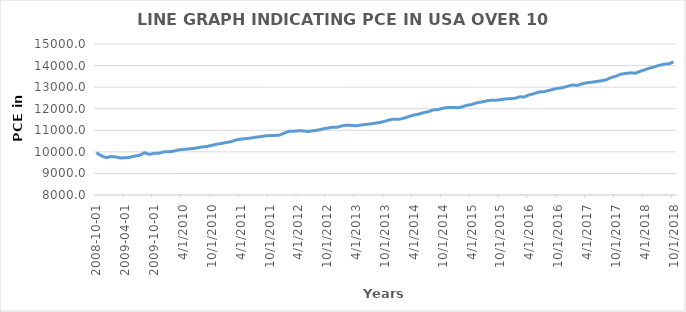
| Category | PCE |
|---|---|
| 2008-10-01 | 9960.3 |
| 2008-11-01 | 9820.8 |
| 2008-12-01 | 9730.7 |
| 2009-01-01 | 9783.8 |
| 2009-02-01 | 9766 |
| 2009-03-01 | 9718.5 |
| 2009-04-01 | 9724.8 |
| 2009-05-01 | 9748.9 |
| 2009-06-01 | 9806.9 |
| 2009-07-01 | 9841.7 |
| 2009-08-01 | 9961 |
| 2009-09-01 | 9883.4 |
| 2009-10-01 | 9931.9 |
| 2009-11-01 | 9940.5 |
| 2009-12-01 | 9998.9 |
| 2010-01-01 | 10001.8 |
| 2010-02-01 | 10030.6 |
| 2010-03-01 | 10089.1 |
| 2010-04-01 | 10112.9 |
| 2010-05-01 | 10131 |
| 2010-06-01 | 10151.4 |
| 2010-07-01 | 10184.7 |
| 2010-08-01 | 10228.2 |
| 2010-09-01 | 10249 |
| 2010-10-01 | 10304.7 |
| 2010-11-01 | 10354.7 |
| 2010-12-01 | 10392.1 |
| 2011-01-01 | 10435.5 |
| 2011-02-01 | 10470.1 |
| 2011-03-01 | 10550.5 |
| 2011-04-01 | 10587.6 |
| 2011-05-01 | 10612 |
| 2011-06-01 | 10636.8 |
| 2011-07-01 | 10677.5 |
| 2011-08-01 | 10700.6 |
| 2011-09-01 | 10738.1 |
| 2011-10-01 | 10753.1 |
| 2011-11-01 | 10759.5 |
| 2011-12-01 | 10772.2 |
| 2012-01-01 | 10862.1 |
| 2012-02-01 | 10953.5 |
| 2012-03-01 | 10951.8 |
| 2012-04-01 | 10979.7 |
| 2012-05-01 | 10968.6 |
| 2012-06-01 | 10946.3 |
| 2012-07-01 | 10977.2 |
| 2012-08-01 | 11004.1 |
| 2012-09-01 | 11061.5 |
| 2012-10-01 | 11099.8 |
| 2012-11-01 | 11136.8 |
| 2012-12-01 | 11140.5 |
| 2013-01-01 | 11202.8 |
| 2013-02-01 | 11239.6 |
| 2013-03-01 | 11227.1 |
| 2013-04-01 | 11205.4 |
| 2013-05-01 | 11244.6 |
| 2013-06-01 | 11268.8 |
| 2013-07-01 | 11296.7 |
| 2013-08-01 | 11329.2 |
| 2013-09-01 | 11366.9 |
| 2013-10-01 | 11419.8 |
| 2013-11-01 | 11487.6 |
| 2013-12-01 | 11517.9 |
| 2014-01-01 | 11512.5 |
| 2014-02-01 | 11566.2 |
| 2014-03-01 | 11643 |
| 2014-04-01 | 11702.6 |
| 2014-05-01 | 11748.4 |
| 2014-06-01 | 11817 |
| 2014-07-01 | 11860.5 |
| 2014-08-01 | 11944.3 |
| 2014-09-01 | 11957.4 |
| 2014-10-01 | 12023 |
| 2014-11-01 | 12051.4 |
| 2014-12-01 | 12062 |
| 2015-01-01 | 12046 |
| 2015-02-01 | 12082.4 |
| 2015-03-01 | 12158.3 |
| 2015-04-01 | 12193.8 |
| 2015-05-01 | 12268.1 |
| 2015-06-01 | 12308.3 |
| 2015-07-01 | 12355.4 |
| 2015-08-01 | 12394 |
| 2015-09-01 | 12392.8 |
| 2015-10-01 | 12416.1 |
| 2015-11-01 | 12450.1 |
| 2015-12-01 | 12469.1 |
| 2016-01-01 | 12482.2 |
| 2016-02-01 | 12550.1 |
| 2016-03-01 | 12547.2 |
| 2016-04-01 | 12646.1 |
| 2016-05-01 | 12698.4 |
| 2016-06-01 | 12775.1 |
| 2016-07-01 | 12790.1 |
| 2016-08-01 | 12841.8 |
| 2016-09-01 | 12903.5 |
| 2016-10-01 | 12944.5 |
| 2016-11-01 | 12980.5 |
| 2016-12-01 | 13043.2 |
| 2017-01-01 | 13098.6 |
| 2017-02-01 | 13084.3 |
| 2017-03-01 | 13159.4 |
| 2017-04-01 | 13204 |
| 2017-05-01 | 13229.5 |
| 2017-06-01 | 13266.1 |
| 2017-07-01 | 13292.1 |
| 2017-08-01 | 13339.1 |
| 2017-09-01 | 13446.1 |
| 2017-10-01 | 13505.5 |
| 2017-11-01 | 13598.5 |
| 2017-12-01 | 13633.6 |
| 2018-01-01 | 13662.6 |
| 2018-02-01 | 13645.9 |
| 2018-03-01 | 13730.3 |
| 2018-04-01 | 13805.2 |
| 2018-05-01 | 13880.6 |
| 2018-06-01 | 13941 |
| 2018-07-01 | 14008.4 |
| 2018-08-01 | 14062.6 |
| 2018-09-01 | 14080.4 |
| 2018-10-01 | 14168.9 |